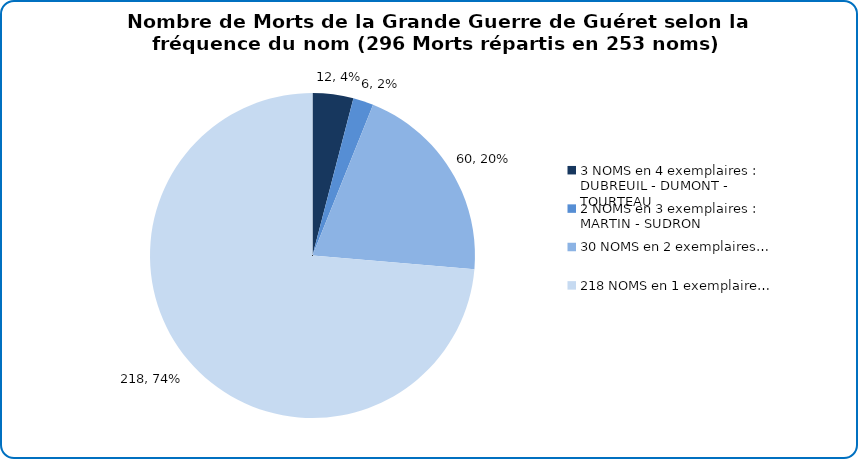
| Category | Nombre de Morts de la Grande Guerre de Guéret selon la fréquence du nom |
|---|---|
| 3 NOMS en 4 exemplaires : DUBREUIL - DUMONT - TOURTEAU | 12 |
| 2 NOMS en 3 exemplaires : MARTIN - SUDRON | 6 |
| 30 NOMS en 2 exemplaires… | 60 |
| 218 NOMS en 1 exemplaire… | 218 |